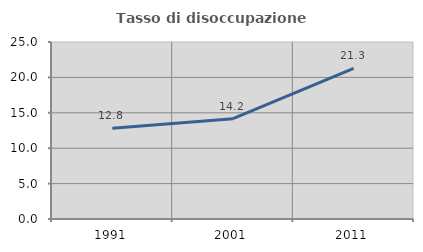
| Category | Tasso di disoccupazione giovanile  |
|---|---|
| 1991.0 | 12.821 |
| 2001.0 | 14.173 |
| 2011.0 | 21.29 |